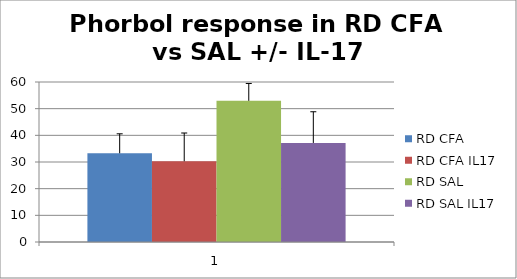
| Category | RD CFA | RD CFA IL17 | RD SAL | RD SAL IL17 |
|---|---|---|---|---|
| 0 | 33.273 | 30.275 | 52.947 | 37.142 |